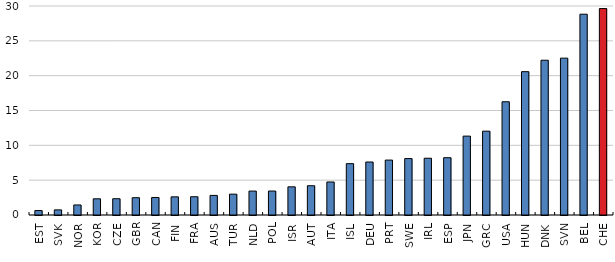
| Category | Series 0 |
|---|---|
| EST | 0.636 |
| SVK | 0.734 |
| NOR | 1.44 |
| KOR | 2.326 |
| CZE | 2.335 |
| GBR | 2.482 |
| CAN | 2.514 |
| FIN | 2.605 |
| FRA | 2.621 |
| AUS | 2.812 |
| TUR | 2.991 |
| NLD | 3.434 |
| POL | 3.44 |
| ISR | 4.043 |
| AUT | 4.2 |
| ITA | 4.741 |
| ISL | 7.371 |
| DEU | 7.607 |
| PRT | 7.882 |
| SWE | 8.1 |
| IRL | 8.146 |
| ESP | 8.225 |
| JPN | 11.323 |
| GRC | 12.034 |
| USA | 16.255 |
| HUN | 20.574 |
| DNK | 22.214 |
| SVN | 22.517 |
| BEL | 28.821 |
| CHE | 29.633 |